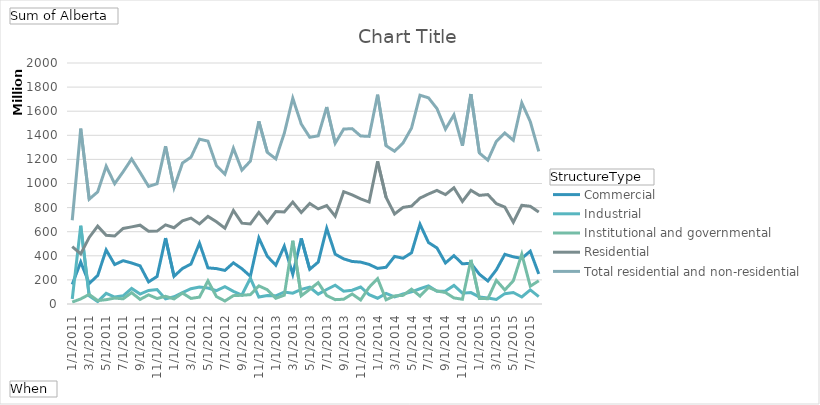
| Category | Commercial | Industrial | Institutional and governmental | Residential | Total residential and non-residential |
|---|---|---|---|---|---|
| 1/1/2011 | 162340000 | 41296000 | 15811000 | 475491000 | 694938000 |
| 2/1/2011 | 348364000 | 649441000 | 42205000 | 415461000 | 1455471000 |
| 3/1/2011 | 170203000 | 67647000 | 79388000 | 552462000 | 869700000 |
| 4/1/2011 | 236572000 | 19392000 | 28415000 | 646014000 | 930393000 |
| 5/1/2011 | 448585000 | 88390000 | 35891000 | 570275000 | 1143141000 |
| 6/1/2011 | 327211000 | 58028000 | 49206000 | 563782000 | 998227000 |
| 7/1/2011 | 359458000 | 68236000 | 42819000 | 626894000 | 1097407000 |
| 8/1/2011 | 340342000 | 129330000 | 93954000 | 640091000 | 1203717000 |
| 9/1/2011 | 316688000 | 82851000 | 38261000 | 653861000 | 1091661000 |
| 10/1/2011 | 183240000 | 112200000 | 75941000 | 604424000 | 975805000 |
| 11/1/2011 | 228117000 | 119468000 | 45626000 | 604800000 | 998011000 |
| 12/1/2011 | 546802000 | 42217000 | 64035000 | 656600000 | 1309654000 |
| 1/1/2012 | 229886000 | 60053000 | 42222000 | 632858000 | 965019000 |
| 2/1/2012 | 294958000 | 94371000 | 90518000 | 690608000 | 1170455000 |
| 3/1/2012 | 331668000 | 126686000 | 46501000 | 713250000 | 1218105000 |
| 4/1/2012 | 504864000 | 140965000 | 56948000 | 665008000 | 1367785000 |
| 5/1/2012 | 299764000 | 132644000 | 192052000 | 727117000 | 1351577000 |
| 6/1/2012 | 293902000 | 111065000 | 61682000 | 682222000 | 1148871000 |
| 7/1/2012 | 278713000 | 143790000 | 24972000 | 629789000 | 1077264000 |
| 8/1/2012 | 341617000 | 105336000 | 69336000 | 776292000 | 1292581000 |
| 9/1/2012 | 292909000 | 74598000 | 72458000 | 670801000 | 1110766000 |
| 10/1/2012 | 230122000 | 213590000 | 77741000 | 664398000 | 1185851000 |
| 11/1/2012 | 548027000 | 57907000 | 150257000 | 760127000 | 1516318000 |
| 12/1/2012 | 395370000 | 70269000 | 118272000 | 674363000 | 1258274000 |
| 1/1/2013 | 322115000 | 67686000 | 47569000 | 767079000 | 1204449000 |
| 2/1/2013 | 479971000 | 99969000 | 73172000 | 763408000 | 1416520000 |
| 3/1/2013 | 246781000 | 90095000 | 524990000 | 845636000 | 1707502000 |
| 4/1/2013 | 544246000 | 121330000 | 68648000 | 759219000 | 1493443000 |
| 5/1/2013 | 288043000 | 139000000 | 121542000 | 835022000 | 1383607000 |
| 6/1/2013 | 347691000 | 81532000 | 177424000 | 788959000 | 1395606000 |
| 7/1/2013 | 628332000 | 120351000 | 70067000 | 816049000 | 1634799000 |
| 8/1/2013 | 413521000 | 156036000 | 36098000 | 728759000 | 1334414000 |
| 9/1/2013 | 374697000 | 105539000 | 39619000 | 931810000 | 1451665000 |
| 10/1/2013 | 352932000 | 114262000 | 82873000 | 905150000 | 1455217000 |
| 11/1/2013 | 347591000 | 141013000 | 33744000 | 871821000 | 1394169000 |
| 12/1/2013 | 328574000 | 77669000 | 138706000 | 846083000 | 1391032000 |
| 1/1/2014 | 295339000 | 47731000 | 210830000 | 1183325000 | 1737225000 |
| 2/1/2014 | 304993000 | 88204000 | 35170000 | 885081000 | 1313448000 |
| 3/1/2014 | 394830000 | 58723000 | 67187000 | 746932000 | 1267672000 |
| 4/1/2014 | 379859000 | 82856000 | 71653000 | 801862000 | 1336230000 |
| 5/1/2014 | 424946000 | 100236000 | 122947000 | 812164000 | 1460293000 |
| 6/1/2014 | 661624000 | 126546000 | 65386000 | 878937000 | 1732493000 |
| 7/1/2014 | 510158000 | 150147000 | 137938000 | 912740000 | 1710983000 |
| 8/1/2014 | 465071000 | 105563000 | 108114000 | 942896000 | 1621644000 |
| 9/1/2014 | 340582000 | 107482000 | 95028000 | 907847000 | 1450939000 |
| 10/1/2014 | 401196000 | 153776000 | 50263000 | 964413000 | 1569648000 |
| 11/1/2014 | 333417000 | 89913000 | 39461000 | 851114000 | 1313905000 |
| 12/1/2014 | 337844000 | 94618000 | 366016000 | 943290000 | 1741768000 |
| 1/1/2015 | 247107000 | 58544000 | 45994000 | 901414000 | 1253059000 |
| 2/1/2015 | 190983000 | 50389000 | 44161000 | 908096000 | 1193629000 |
| 3/1/2015 | 283785000 | 37162000 | 196035000 | 832885000 | 1349867000 |
| 4/1/2015 | 412286000 | 85973000 | 116370000 | 804225000 | 1418854000 |
| 5/1/2015 | 391403000 | 95655000 | 192868000 | 678780000 | 1358706000 |
| 6/1/2015 | 378689000 | 58002000 | 413406000 | 819382000 | 1669479000 |
| 7/1/2015 | 438396000 | 116910000 | 147655000 | 810867000 | 1513828000 |
| 8/1/2015 | 249453000 | 61195000 | 192893000 | 762985000 | 1266526000 |